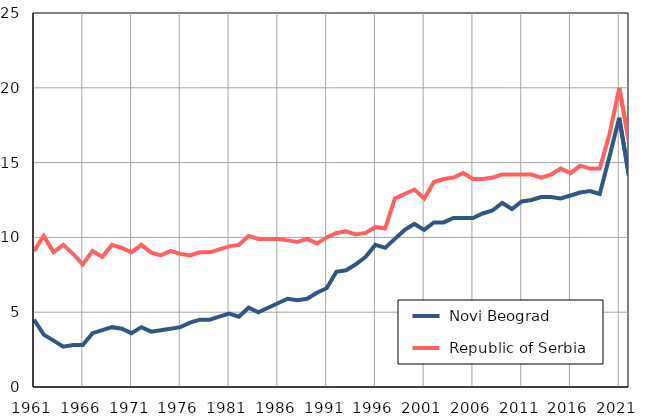
| Category |  Novi Beograd |  Republic of Serbia |
|---|---|---|
| 1961.0 | 4.5 | 9.1 |
| 1962.0 | 3.5 | 10.1 |
| 1963.0 | 3.1 | 9 |
| 1964.0 | 2.7 | 9.5 |
| 1965.0 | 2.8 | 8.9 |
| 1966.0 | 2.8 | 8.2 |
| 1967.0 | 3.6 | 9.1 |
| 1968.0 | 3.8 | 8.7 |
| 1969.0 | 4 | 9.5 |
| 1970.0 | 3.9 | 9.3 |
| 1971.0 | 3.6 | 9 |
| 1972.0 | 4 | 9.5 |
| 1973.0 | 3.7 | 9 |
| 1974.0 | 3.8 | 8.8 |
| 1975.0 | 3.9 | 9.1 |
| 1976.0 | 4 | 8.9 |
| 1977.0 | 4.3 | 8.8 |
| 1978.0 | 4.5 | 9 |
| 1979.0 | 4.5 | 9 |
| 1980.0 | 4.7 | 9.2 |
| 1981.0 | 4.9 | 9.4 |
| 1982.0 | 4.7 | 9.5 |
| 1983.0 | 5.3 | 10.1 |
| 1984.0 | 5 | 9.9 |
| 1985.0 | 5.3 | 9.9 |
| 1986.0 | 5.6 | 9.9 |
| 1987.0 | 5.9 | 9.8 |
| 1988.0 | 5.8 | 9.7 |
| 1989.0 | 5.9 | 9.9 |
| 1990.0 | 6.3 | 9.6 |
| 1991.0 | 6.6 | 10 |
| 1992.0 | 7.7 | 10.3 |
| 1993.0 | 7.8 | 10.4 |
| 1994.0 | 8.2 | 10.2 |
| 1995.0 | 8.7 | 10.3 |
| 1996.0 | 9.5 | 10.7 |
| 1997.0 | 9.3 | 10.6 |
| 1998.0 | 9.9 | 12.6 |
| 1999.0 | 10.5 | 12.9 |
| 2000.0 | 10.9 | 13.2 |
| 2001.0 | 10.5 | 12.6 |
| 2002.0 | 11 | 13.7 |
| 2003.0 | 11 | 13.9 |
| 2004.0 | 11.3 | 14 |
| 2005.0 | 11.3 | 14.3 |
| 2006.0 | 11.3 | 13.9 |
| 2007.0 | 11.6 | 13.9 |
| 2008.0 | 11.8 | 14 |
| 2009.0 | 12.3 | 14.2 |
| 2010.0 | 11.9 | 14.2 |
| 2011.0 | 12.4 | 14.2 |
| 2012.0 | 12.5 | 14.2 |
| 2013.0 | 12.7 | 14 |
| 2014.0 | 12.7 | 14.2 |
| 2015.0 | 12.6 | 14.6 |
| 2016.0 | 12.8 | 14.3 |
| 2017.0 | 13 | 14.8 |
| 2018.0 | 13.1 | 14.6 |
| 2019.0 | 12.9 | 14.6 |
| 2020.0 | 15.4 | 16.9 |
| 2021.0 | 18 | 20 |
| 2022.0 | 14.1 | 16.4 |